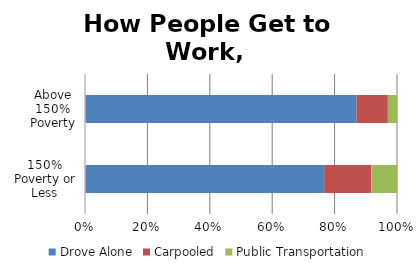
| Category | Drove Alone | Carpooled | Public Transportation |
|---|---|---|---|
| 150% Poverty or Less | 0.644 | 0.127 | 0.069 |
| Above 150% Poverty | 0.79 | 0.091 | 0.027 |